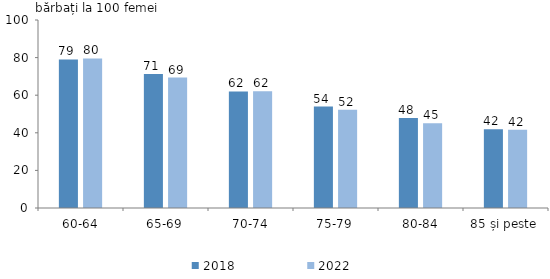
| Category | 2018 | 2022 |
|---|---|---|
| 60-64 | 79 | 79.536 |
| 65-69 | 71.289 | 69.368 |
| 70-74 | 62 | 62.042 |
| 75-79 | 53.979 | 52.288 |
| 80-84 | 47.931 | 45.027 |
| 85 și peste | 41.84 | 41.578 |